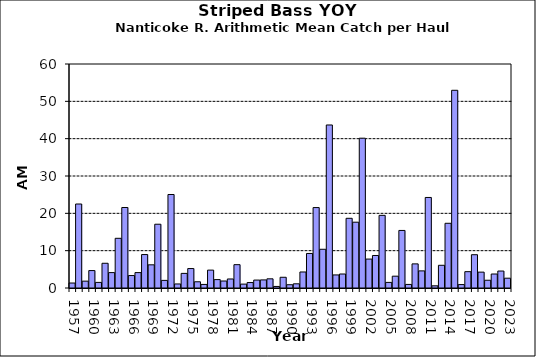
| Category | Series 0 |
|---|---|
| 1957.0 | 1.333 |
| 1958.0 | 22.5 |
| 1959.0 | 1.833 |
| 1960.0 | 4.667 |
| 1961.0 | 1.5 |
| 1962.0 | 6.625 |
| 1963.0 | 4.125 |
| 1964.0 | 13.312 |
| 1965.0 | 21.562 |
| 1966.0 | 3.333 |
| 1967.0 | 4.125 |
| 1968.0 | 8.958 |
| 1969.0 | 6.208 |
| 1970.0 | 17.083 |
| 1971.0 | 2.042 |
| 1972.0 | 25.042 |
| 1973.0 | 1.083 |
| 1974.0 | 3.917 |
| 1975.0 | 5.208 |
| 1976.0 | 1.667 |
| 1977.0 | 0.958 |
| 1978.0 | 4.792 |
| 1979.0 | 2.25 |
| 1980.0 | 1.875 |
| 1981.0 | 2.417 |
| 1982.0 | 6.25 |
| 1983.0 | 1.042 |
| 1984.0 | 1.458 |
| 1985.0 | 2.125 |
| 1986.0 | 2.167 |
| 1987.0 | 2.458 |
| 1988.0 | 0.417 |
| 1989.0 | 2.875 |
| 1990.0 | 0.875 |
| 1991.0 | 1.125 |
| 1992.0 | 4.292 |
| 1993.0 | 9.25 |
| 1994.0 | 21.542 |
| 1995.0 | 10.375 |
| 1996.0 | 43.667 |
| 1997.0 | 3.5 |
| 1998.0 | 3.75 |
| 1999.0 | 18.667 |
| 2000.0 | 17.625 |
| 2001.0 | 40.125 |
| 2002.0 | 7.75 |
| 2003.0 | 8.708 |
| 2004.0 | 19.46 |
| 2005.0 | 1.5 |
| 2006.0 | 3.167 |
| 2007.0 | 15.417 |
| 2008.0 | 0.958 |
| 2009.0 | 6.458 |
| 2010.0 | 4.583 |
| 2011.0 | 24.25 |
| 2012.0 | 0.583 |
| 2013.0 | 6.083 |
| 2014.0 | 17.333 |
| 2015.0 | 52.958 |
| 2016.0 | 0.917 |
| 2017.0 | 4.375 |
| 2018.0 | 8.917 |
| 2019.0 | 4.25 |
| 2020.0 | 2.08 |
| 2021.0 | 3.75 |
| 2022.0 | 4.542 |
| 2023.0 | 2.625 |